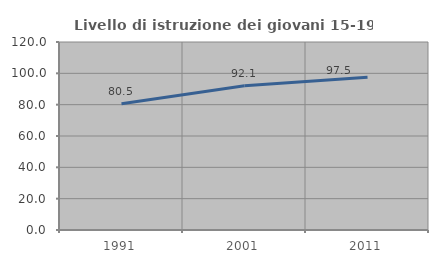
| Category | Livello di istruzione dei giovani 15-19 anni |
|---|---|
| 1991.0 | 80.519 |
| 2001.0 | 92.05 |
| 2011.0 | 97.484 |